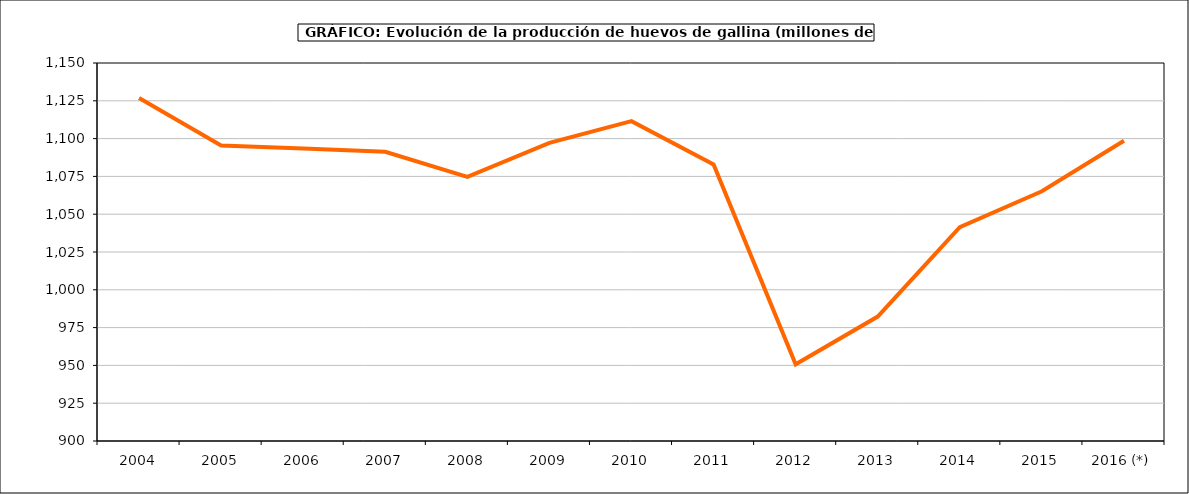
| Category | huevos gallina |
|---|---|
| 2004 | 1126.913 |
| 2005 | 1095.445 |
| 2006 | 1093.512 |
| 2007 | 1091.274 |
| 2008 | 1074.66 |
| 2009 | 1097.178 |
| 2010 | 1111.55 |
| 2011 | 1082.947 |
| 2012 | 950.76 |
| 2013 | 982.284 |
| 2014 | 1041.475 |
| 2015 | 1065.149 |
| 2016 (*) | 1098.62 |